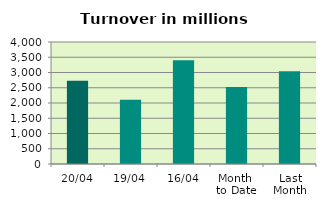
| Category | Series 0 |
|---|---|
| 20/04 | 2725.827 |
| 19/04 | 2105.185 |
| 16/04 | 3400.589 |
| Month 
to Date | 2522.046 |
| Last
Month | 3040.277 |